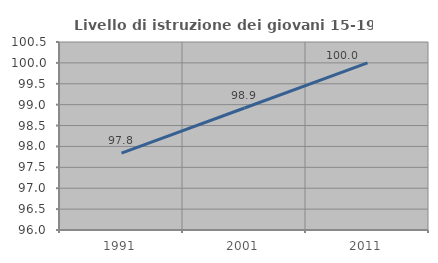
| Category | Livello di istruzione dei giovani 15-19 anni |
|---|---|
| 1991.0 | 97.84 |
| 2001.0 | 98.921 |
| 2011.0 | 100 |